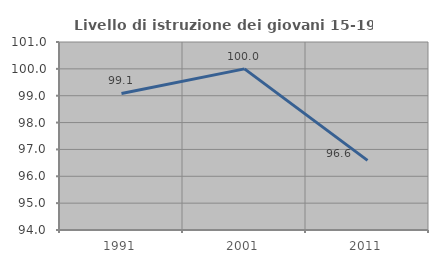
| Category | Livello di istruzione dei giovani 15-19 anni |
|---|---|
| 1991.0 | 99.083 |
| 2001.0 | 100 |
| 2011.0 | 96.591 |